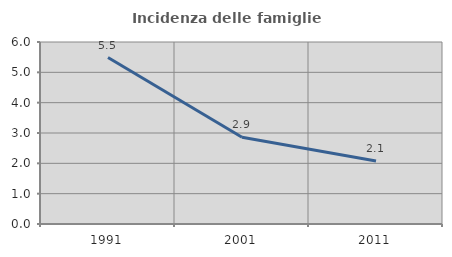
| Category | Incidenza delle famiglie numerose |
|---|---|
| 1991.0 | 5.487 |
| 2001.0 | 2.861 |
| 2011.0 | 2.075 |